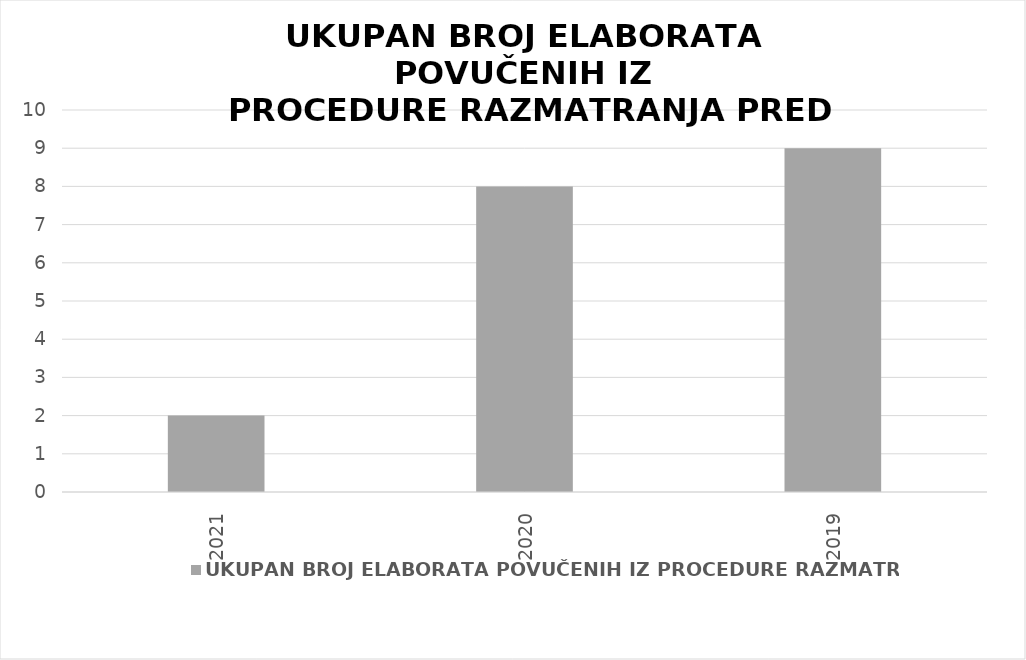
| Category | UKUPAN BROJ ELABORATA POVUČENIH IZ PROCEDURE RAZMATRANJA |
|---|---|
| 2021.0 | 2 |
| 2020.0 | 8 |
| 2019.0 | 9 |